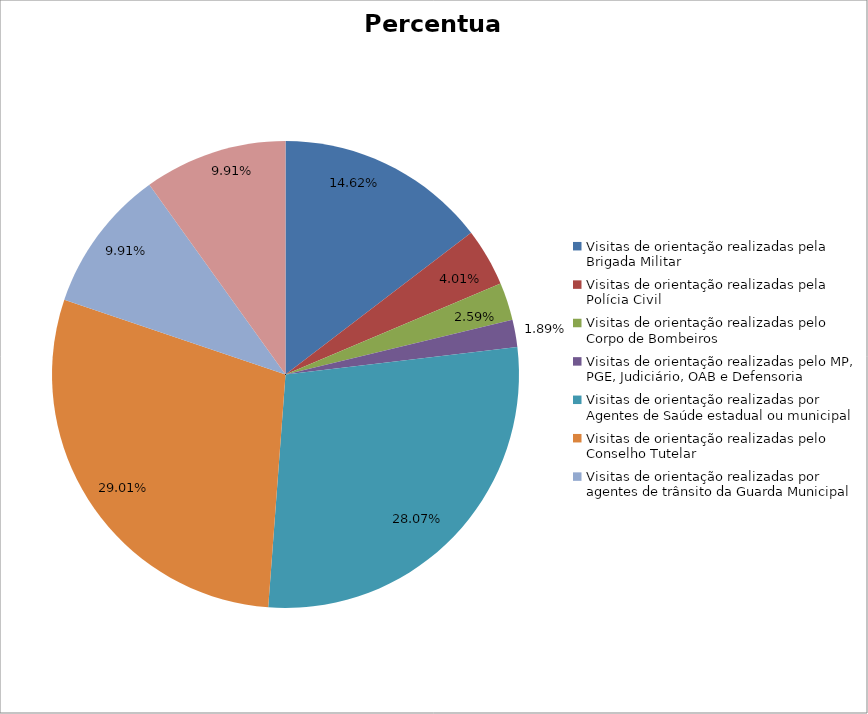
| Category | Percentual |
|---|---|
| Visitas de orientação realizadas pela Brigada Militar | 0.146 |
| Visitas de orientação realizadas pela Polícia Civil | 0.04 |
| Visitas de orientação realizadas pelo Corpo de Bombeiros | 0.026 |
| Visitas de orientação realizadas pelo MP, PGE, Judiciário, OAB e Defensoria | 0.019 |
| Visitas de orientação realizadas por Agentes de Saúde estadual ou municipal | 0.281 |
| Visitas de orientação realizadas pelo Conselho Tutelar | 0.29 |
| Visitas de orientação realizadas por agentes de trânsito da Guarda Municipal | 0.099 |
| Visitas de orientação realizadas por ONGs, entidades privadas, CRAS e CREAS | 0.099 |